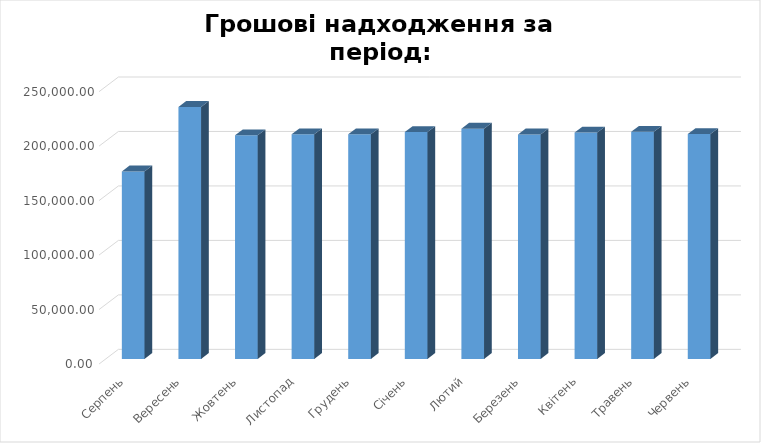
| Category | Series 0 |
|---|---|
| Серпень | 172137.93 |
| Вересень | 231329.47 |
| Жовтень | 205286.48 |
| Листопад | 206228.24 |
| Грудень | 206128.07 |
| Січень | 208194.31 |
| Лютий | 211365.12 |
| Березень | 206073.93 |
| Квітень | 207829.99 |
| Травень | 208425.45 |
| Червень | 206367.72 |